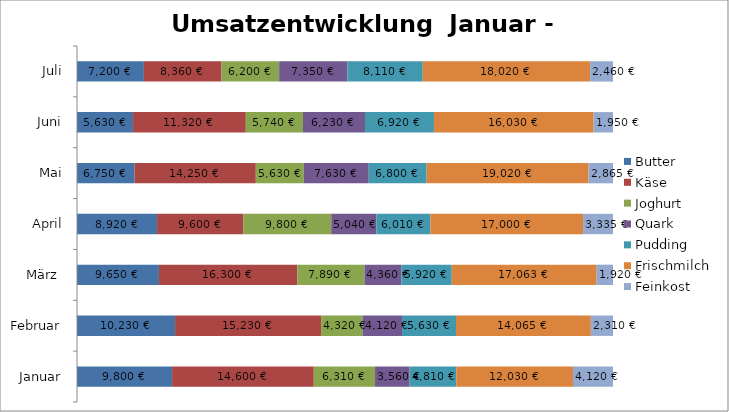
| Category | Butter | Käse | Joghurt | Quark | Pudding | Frischmilch | Feinkost |
|---|---|---|---|---|---|---|---|
| Januar | 9800 | 14600 | 6310 | 3560 | 4810 | 12030 | 4120 |
| Februar | 10230 | 15230 | 4320 | 4120 | 5630 | 14065 | 2310 |
| März  | 9650 | 16300 | 7890 | 4360 | 5920 | 17063 | 1920 |
| April | 8920 | 9600 | 9800 | 5040 | 6010 | 17000 | 3335 |
| Mai | 6750 | 14250 | 5630 | 7630 | 6800 | 19020 | 2865 |
| Juni | 5630 | 11320 | 5740 | 6230 | 6920 | 16030 | 1950 |
| Juli | 7200 | 8360 | 6200 | 7350 | 8110 | 18020 | 2460 |